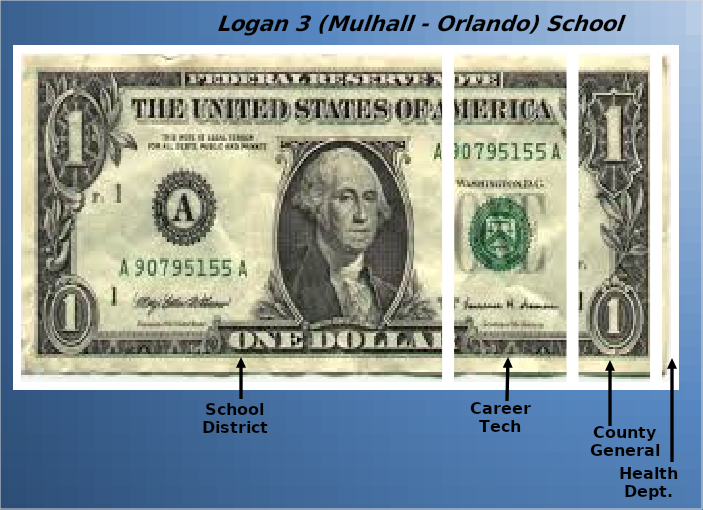
| Category | School District | Career Tech | County General | Health Dept. |
|---|---|---|---|---|
| 0 | 0.654 | 0.188 | 0.126 | 0.032 |